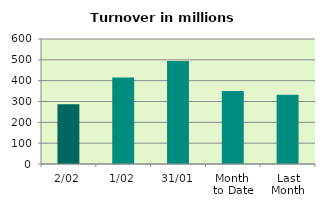
| Category | Series 0 |
|---|---|
| 2/02 | 286.248 |
| 1/02 | 414.77 |
| 31/01 | 493.836 |
| Month 
to Date | 350.509 |
| Last
Month | 332.646 |